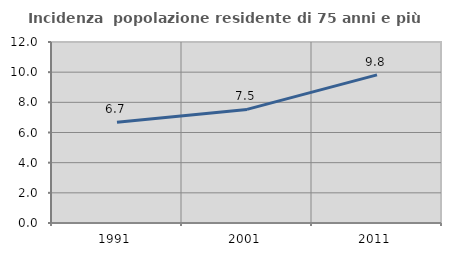
| Category | Incidenza  popolazione residente di 75 anni e più |
|---|---|
| 1991.0 | 6.679 |
| 2001.0 | 7.531 |
| 2011.0 | 9.822 |